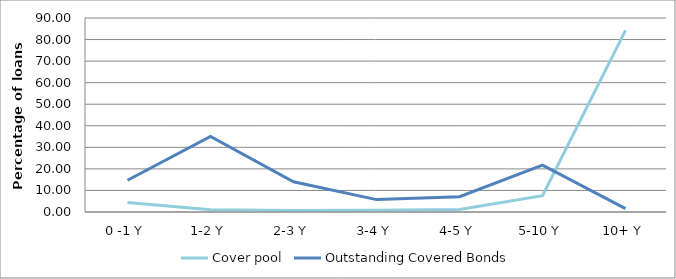
| Category | Cover pool | Outstanding Covered Bonds |
|---|---|---|
| 0 -1 Y | 4.386 | 14.75 |
| 1-2 Y | 1.069 | 35.057 |
| 2-3 Y | 0.688 | 14.023 |
| 3-4 Y | 0.8 | 5.755 |
| 4-5 Y | 1.196 | 7.097 |
| 5-10 Y | 7.589 | 21.761 |
| 10+ Y | 84.273 | 1.558 |